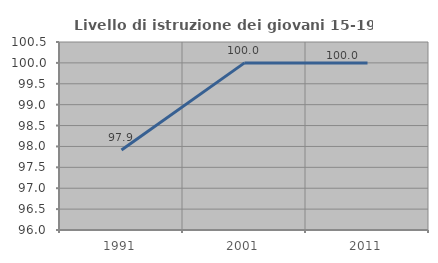
| Category | Livello di istruzione dei giovani 15-19 anni |
|---|---|
| 1991.0 | 97.917 |
| 2001.0 | 100 |
| 2011.0 | 100 |